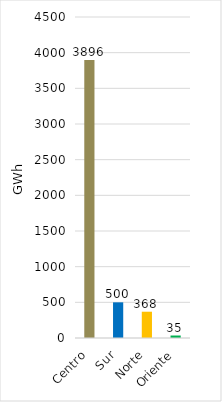
| Category | Series 0 |
|---|---|
| Centro | 3896.333 |
| Sur | 499.975 |
| Norte | 368.468 |
| Oriente | 34.88 |